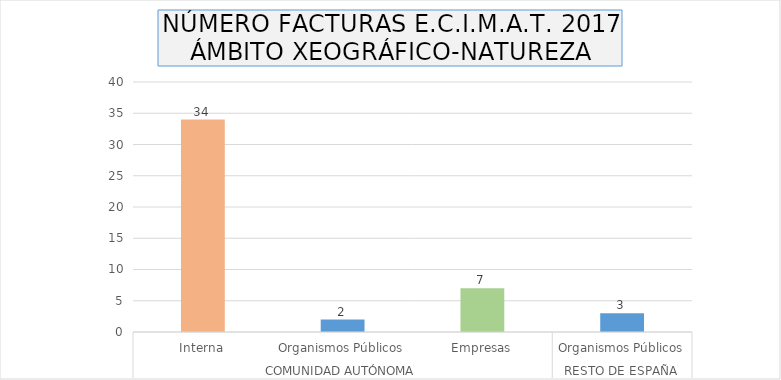
| Category | Series 0 |
|---|---|
| 0 | 34 |
| 1 | 2 |
| 2 | 7 |
| 3 | 3 |